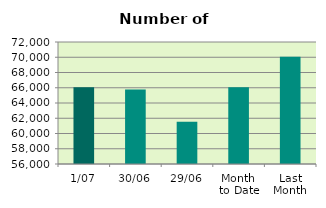
| Category | Series 0 |
|---|---|
| 1/07 | 66080 |
| 30/06 | 65764 |
| 29/06 | 61526 |
| Month 
to Date | 66080 |
| Last
Month | 70062.455 |